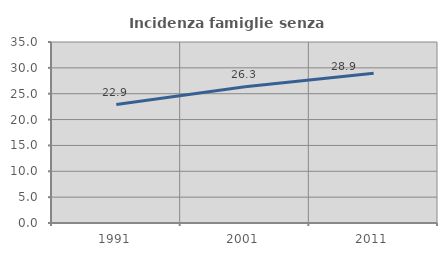
| Category | Incidenza famiglie senza nuclei |
|---|---|
| 1991.0 | 22.907 |
| 2001.0 | 26.349 |
| 2011.0 | 28.937 |